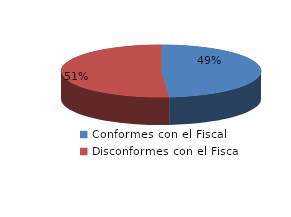
| Category | Series 0 |
|---|---|
| 0 | 1569 |
| 1 | 1653 |